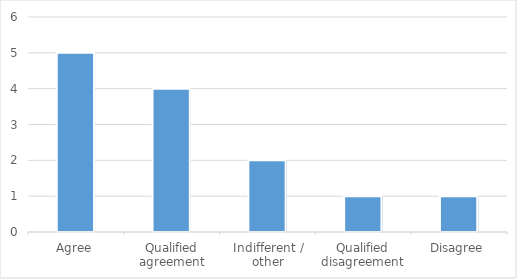
| Category | Series 0 |
|---|---|
| Agree | 5 |
| Qualified agreement | 4 |
| Indifferent / other | 2 |
| Qualified disagreement | 1 |
| Disagree | 1 |